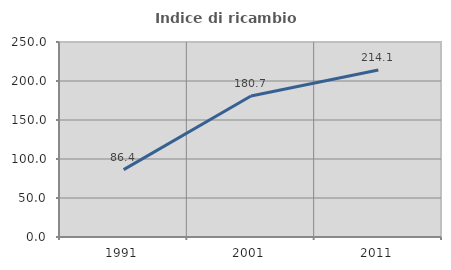
| Category | Indice di ricambio occupazionale  |
|---|---|
| 1991.0 | 86.43 |
| 2001.0 | 180.742 |
| 2011.0 | 214.066 |